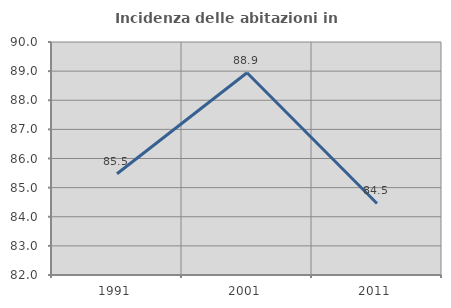
| Category | Incidenza delle abitazioni in proprietà  |
|---|---|
| 1991.0 | 85.475 |
| 2001.0 | 88.945 |
| 2011.0 | 84.456 |